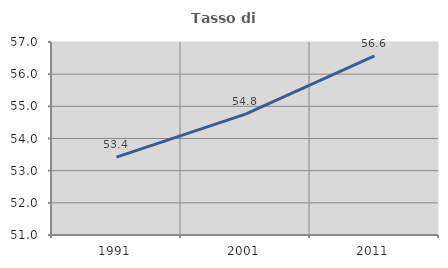
| Category | Tasso di occupazione   |
|---|---|
| 1991.0 | 53.423 |
| 2001.0 | 54.757 |
| 2011.0 | 56.569 |